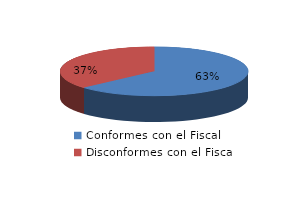
| Category | Series 0 |
|---|---|
| 0 | 19 |
| 1 | 11 |